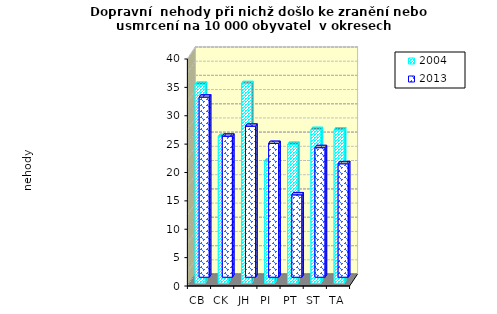
| Category | 2004 | 2013 |
|---|---|---|
| CB | 35.035 | 31.722 |
| CK | 25.853 | 24.835 |
| JH | 35.154 | 26.596 |
| PI  | 21.485 | 23.56 |
| PT | 24.46 | 14.508 |
| ST | 27.069 | 22.822 |
| TA | 26.996 | 19.981 |